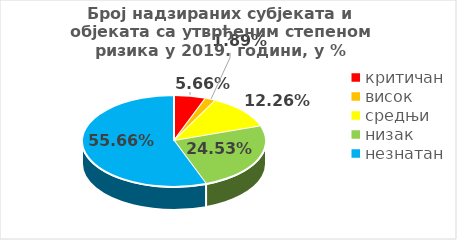
| Category | Series 0 |
|---|---|
| критичан | 0.057 |
| висок | 0.019 |
| средњи | 0.123 |
| низак | 0.245 |
| незнатан | 0.557 |